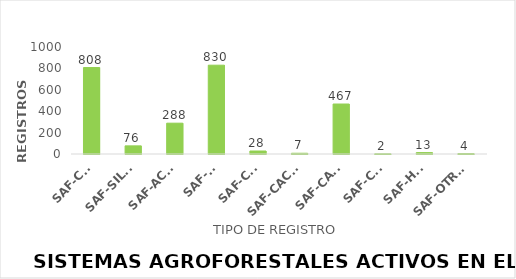
| Category | Series 0 |
|---|---|
| SAF-CAP | 808 |
| SAF-SILVO | 76 |
| SAF-ACAB | 288 |
| SAF-AL | 830 |
| SAF-CRV | 28 |
| SAF-CACAO | 7 |
| SAF-CAFÉ | 467 |
| SAF-CAR | 2 |
| SAF-HFM | 13 |
| SAF-OTROS | 4 |